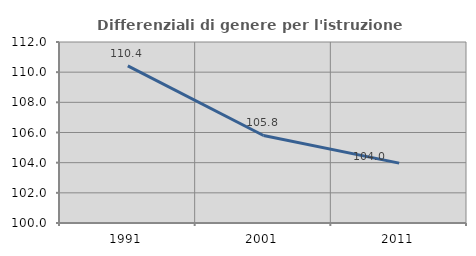
| Category | Differenziali di genere per l'istruzione superiore |
|---|---|
| 1991.0 | 110.417 |
| 2001.0 | 105.802 |
| 2011.0 | 103.97 |